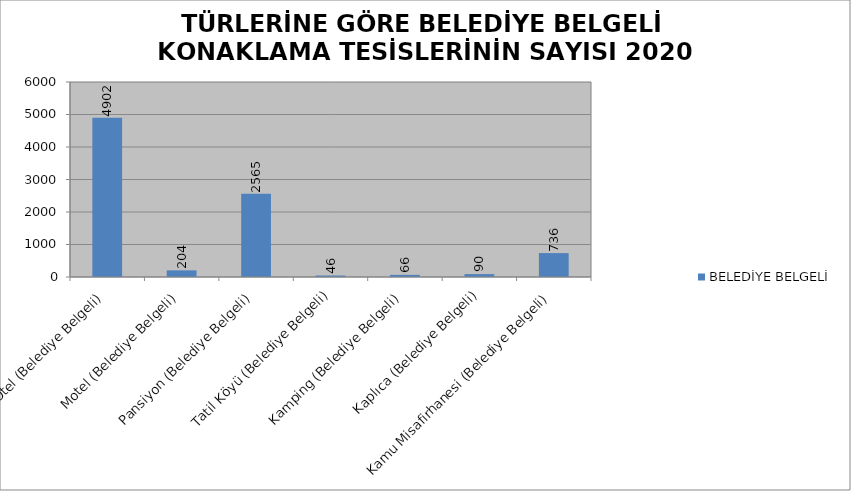
| Category | BELEDİYE BELGELİ |
|---|---|
| Otel (Belediye Belgeli) | 4902 |
| Motel (Belediye Belgeli) | 204 |
| Pansiyon (Belediye Belgeli) | 2565 |
| Tatil Köyü (Belediye Belgeli) | 46 |
| Kamping (Belediye Belgeli) | 66 |
| Kaplıca (Belediye Belgeli) | 90 |
| Kamu Misafirhanesi (Belediye Belgeli) | 736 |